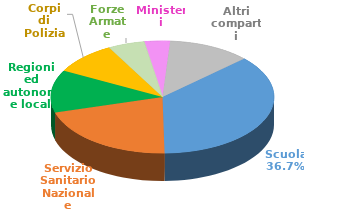
| Category | Series 0 |
|---|---|
| Scuola | 1198957 |
| Servizio Sanitario Nazionale | 681855 |
| Regioni ed autonomie locali | 400010 |
| Corpi di Polizia | 303440 |
| Forze Armate | 172839 |
| Ministeri | 122469 |
| Altri comparti | 391214 |